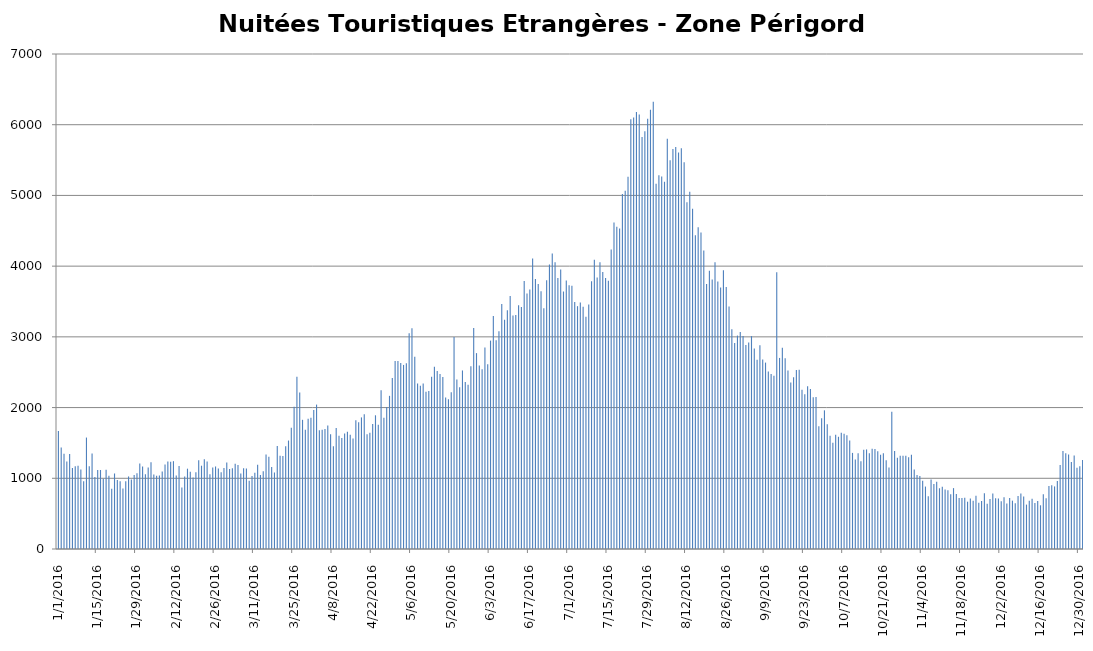
| Category | Nuitées Etrangères |
|---|---|
| 1/1/16 | 1670 |
| 1/2/16 | 1435 |
| 1/3/16 | 1347 |
| 1/4/16 | 1237 |
| 1/5/16 | 1344 |
| 1/6/16 | 1145 |
| 1/7/16 | 1171 |
| 1/8/16 | 1179 |
| 1/9/16 | 1125 |
| 1/10/16 | 958 |
| 1/11/16 | 1576 |
| 1/12/16 | 1171 |
| 1/13/16 | 1351 |
| 1/14/16 | 1017 |
| 1/15/16 | 1117 |
| 1/16/16 | 1117 |
| 1/17/16 | 992 |
| 1/18/16 | 1119 |
| 1/19/16 | 1037 |
| 1/20/16 | 853 |
| 1/21/16 | 1068 |
| 1/22/16 | 977 |
| 1/23/16 | 959 |
| 1/24/16 | 857 |
| 1/25/16 | 959 |
| 1/26/16 | 1026 |
| 1/27/16 | 982 |
| 1/28/16 | 1047 |
| 1/29/16 | 1070 |
| 1/30/16 | 1210 |
| 1/31/16 | 1167 |
| 2/1/16 | 1056 |
| 2/2/16 | 1152 |
| 2/3/16 | 1226 |
| 2/4/16 | 1055 |
| 2/5/16 | 1036 |
| 2/6/16 | 1038 |
| 2/7/16 | 1097 |
| 2/8/16 | 1196 |
| 2/9/16 | 1237 |
| 2/10/16 | 1235 |
| 2/11/16 | 1242 |
| 2/12/16 | 1040 |
| 2/13/16 | 1174 |
| 2/14/16 | 869 |
| 2/15/16 | 1025 |
| 2/16/16 | 1136 |
| 2/17/16 | 1094 |
| 2/18/16 | 1010 |
| 2/19/16 | 1086 |
| 2/20/16 | 1256 |
| 2/21/16 | 1178 |
| 2/22/16 | 1268 |
| 2/23/16 | 1237 |
| 2/24/16 | 1058 |
| 2/25/16 | 1151 |
| 2/26/16 | 1167 |
| 2/27/16 | 1138 |
| 2/28/16 | 1086 |
| 2/29/16 | 1144 |
| 3/1/16 | 1225 |
| 3/2/16 | 1132 |
| 3/3/16 | 1141 |
| 3/4/16 | 1204 |
| 3/5/16 | 1187 |
| 3/6/16 | 1066 |
| 3/7/16 | 1142 |
| 3/8/16 | 1138 |
| 3/9/16 | 966 |
| 3/10/16 | 1032 |
| 3/11/16 | 1077 |
| 3/12/16 | 1192 |
| 3/13/16 | 1046 |
| 3/14/16 | 1100 |
| 3/15/16 | 1335 |
| 3/16/16 | 1306 |
| 3/17/16 | 1158 |
| 3/18/16 | 1082 |
| 3/19/16 | 1455 |
| 3/20/16 | 1318 |
| 3/21/16 | 1315 |
| 3/22/16 | 1453 |
| 3/23/16 | 1534 |
| 3/24/16 | 1715 |
| 3/25/16 | 2011 |
| 3/26/16 | 2436 |
| 3/27/16 | 2214 |
| 3/28/16 | 1827 |
| 3/29/16 | 1687 |
| 3/30/16 | 1843 |
| 3/31/16 | 1856 |
| 4/1/16 | 1966 |
| 4/2/16 | 2042 |
| 4/3/16 | 1678 |
| 4/4/16 | 1688 |
| 4/5/16 | 1696 |
| 4/6/16 | 1747 |
| 4/7/16 | 1623 |
| 4/8/16 | 1453 |
| 4/9/16 | 1712 |
| 4/10/16 | 1603 |
| 4/11/16 | 1569 |
| 4/12/16 | 1634 |
| 4/13/16 | 1659 |
| 4/14/16 | 1617 |
| 4/15/16 | 1563 |
| 4/16/16 | 1822 |
| 4/17/16 | 1794 |
| 4/18/16 | 1861 |
| 4/19/16 | 1906 |
| 4/20/16 | 1624 |
| 4/21/16 | 1644 |
| 4/22/16 | 1769 |
| 4/23/16 | 1891 |
| 4/24/16 | 1758 |
| 4/25/16 | 2246 |
| 4/26/16 | 1856 |
| 4/27/16 | 2007 |
| 4/28/16 | 2166 |
| 4/29/16 | 2419 |
| 4/30/16 | 2657 |
| 5/1/16 | 2660 |
| 5/2/16 | 2631 |
| 5/3/16 | 2603 |
| 5/4/16 | 2626 |
| 5/5/16 | 3051 |
| 5/6/16 | 3121 |
| 5/7/16 | 2718 |
| 5/8/16 | 2341 |
| 5/9/16 | 2308 |
| 5/10/16 | 2340 |
| 5/11/16 | 2222 |
| 5/12/16 | 2236 |
| 5/13/16 | 2436 |
| 5/14/16 | 2577 |
| 5/15/16 | 2518 |
| 5/16/16 | 2475 |
| 5/17/16 | 2432.5 |
| 5/18/16 | 2143 |
| 5/19/16 | 2116 |
| 5/20/16 | 2215 |
| 5/21/16 | 2998 |
| 5/22/16 | 2398 |
| 5/23/16 | 2287 |
| 5/24/16 | 2525 |
| 5/25/16 | 2361 |
| 5/26/16 | 2324 |
| 5/27/16 | 2584 |
| 5/28/16 | 3124 |
| 5/29/16 | 2770 |
| 5/30/16 | 2595 |
| 5/31/16 | 2543 |
| 6/1/16 | 2850 |
| 6/2/16 | 2613 |
| 6/3/16 | 2947 |
| 6/4/16 | 3296 |
| 6/5/16 | 2953 |
| 6/6/16 | 3079 |
| 6/7/16 | 3465 |
| 6/8/16 | 3242 |
| 6/9/16 | 3375 |
| 6/10/16 | 3578 |
| 6/11/16 | 3302 |
| 6/12/16 | 3309 |
| 6/13/16 | 3446 |
| 6/14/16 | 3421 |
| 6/15/16 | 3790 |
| 6/16/16 | 3613 |
| 6/17/16 | 3670 |
| 6/18/16 | 4107 |
| 6/19/16 | 3817 |
| 6/20/16 | 3749 |
| 6/21/16 | 3644 |
| 6/22/16 | 3403 |
| 6/23/16 | 3802 |
| 6/24/16 | 4024 |
| 6/25/16 | 4178 |
| 6/26/16 | 4056 |
| 6/27/16 | 3834 |
| 6/28/16 | 3954 |
| 6/29/16 | 3640 |
| 6/30/16 | 3797 |
| 7/1/16 | 3730 |
| 7/2/16 | 3722 |
| 7/3/16 | 3492 |
| 7/4/16 | 3434 |
| 7/5/16 | 3487 |
| 7/6/16 | 3425 |
| 7/7/16 | 3286 |
| 7/8/16 | 3457 |
| 7/9/16 | 3788 |
| 7/10/16 | 4089 |
| 7/11/16 | 3841 |
| 7/12/16 | 4056 |
| 7/13/16 | 3918 |
| 7/14/16 | 3833 |
| 7/15/16 | 3794 |
| 7/16/16 | 4234 |
| 7/17/16 | 4618 |
| 7/18/16 | 4557 |
| 7/19/16 | 4534 |
| 7/20/16 | 5019 |
| 7/21/16 | 5065 |
| 7/22/16 | 5265 |
| 7/23/16 | 6078 |
| 7/24/16 | 6103 |
| 7/25/16 | 6179 |
| 7/26/16 | 6145 |
| 7/27/16 | 5825 |
| 7/28/16 | 5907 |
| 7/29/16 | 6084 |
| 7/30/16 | 6213 |
| 7/31/16 | 6323 |
| 8/1/16 | 5164 |
| 8/2/16 | 5285 |
| 8/3/16 | 5269 |
| 8/4/16 | 5195 |
| 8/5/16 | 5801 |
| 8/6/16 | 5499 |
| 8/7/16 | 5657 |
| 8/8/16 | 5685 |
| 8/9/16 | 5608 |
| 8/10/16 | 5667 |
| 8/11/16 | 5468 |
| 8/12/16 | 4903 |
| 8/13/16 | 5053 |
| 8/14/16 | 4810 |
| 8/15/16 | 4437 |
| 8/16/16 | 4550 |
| 8/17/16 | 4477 |
| 8/18/16 | 4222 |
| 8/19/16 | 3747 |
| 8/20/16 | 3934 |
| 8/21/16 | 3811 |
| 8/22/16 | 4056 |
| 8/23/16 | 3784 |
| 8/24/16 | 3697 |
| 8/25/16 | 3943 |
| 8/26/16 | 3705 |
| 8/27/16 | 3431 |
| 8/28/16 | 3106 |
| 8/29/16 | 2914 |
| 8/30/16 | 3018 |
| 8/31/16 | 3069 |
| 9/1/16 | 3011 |
| 9/2/16 | 2884 |
| 9/3/16 | 2921 |
| 9/4/16 | 3011 |
| 9/5/16 | 2837 |
| 9/6/16 | 2676 |
| 9/7/16 | 2882 |
| 9/8/16 | 2681 |
| 9/9/16 | 2636 |
| 9/10/16 | 2510 |
| 9/11/16 | 2476 |
| 9/12/16 | 2450 |
| 9/13/16 | 3915 |
| 9/14/16 | 2702 |
| 9/15/16 | 2847 |
| 9/16/16 | 2699 |
| 9/17/16 | 2523 |
| 9/18/16 | 2355 |
| 9/19/16 | 2429 |
| 9/20/16 | 2531 |
| 9/21/16 | 2535 |
| 9/22/16 | 2253 |
| 9/23/16 | 2190 |
| 9/24/16 | 2302 |
| 9/25/16 | 2262 |
| 9/26/16 | 2147 |
| 9/27/16 | 2150 |
| 9/28/16 | 1736 |
| 9/29/16 | 1849 |
| 9/30/16 | 1961 |
| 10/1/16 | 1764 |
| 10/2/16 | 1603 |
| 10/3/16 | 1503 |
| 10/4/16 | 1615 |
| 10/5/16 | 1587 |
| 10/6/16 | 1643 |
| 10/7/16 | 1630 |
| 10/8/16 | 1608 |
| 10/9/16 | 1536 |
| 10/10/16 | 1359 |
| 10/11/16 | 1265 |
| 10/12/16 | 1353 |
| 10/13/16 | 1242 |
| 10/14/16 | 1402 |
| 10/15/16 | 1408 |
| 10/16/16 | 1353 |
| 10/17/16 | 1418 |
| 10/18/16 | 1415 |
| 10/19/16 | 1381 |
| 10/20/16 | 1334 |
| 10/21/16 | 1353 |
| 10/22/16 | 1254 |
| 10/23/16 | 1152 |
| 10/24/16 | 1940 |
| 10/25/16 | 1386 |
| 10/26/16 | 1289 |
| 10/27/16 | 1317 |
| 10/28/16 | 1317 |
| 10/29/16 | 1320 |
| 10/30/16 | 1297 |
| 10/31/16 | 1334 |
| 11/1/16 | 1125 |
| 11/2/16 | 1047 |
| 11/3/16 | 1032 |
| 11/4/16 | 966 |
| 11/5/16 | 883 |
| 11/6/16 | 746 |
| 11/7/16 | 982 |
| 11/8/16 | 918 |
| 11/9/16 | 950 |
| 11/10/16 | 859 |
| 11/11/16 | 879 |
| 11/12/16 | 843 |
| 11/13/16 | 832 |
| 11/14/16 | 773 |
| 11/15/16 | 861 |
| 11/16/16 | 777 |
| 11/17/16 | 722 |
| 11/18/16 | 720 |
| 11/19/16 | 726 |
| 11/20/16 | 669 |
| 11/21/16 | 715 |
| 11/22/16 | 684 |
| 11/23/16 | 753 |
| 11/24/16 | 654 |
| 11/25/16 | 678 |
| 11/26/16 | 790 |
| 11/27/16 | 640 |
| 11/28/16 | 707 |
| 11/29/16 | 785 |
| 11/30/16 | 718 |
| 12/1/16 | 715 |
| 12/2/16 | 675 |
| 12/3/16 | 731 |
| 12/4/16 | 643 |
| 12/5/16 | 721 |
| 12/6/16 | 684 |
| 12/7/16 | 647 |
| 12/8/16 | 751 |
| 12/9/16 | 784 |
| 12/10/16 | 742 |
| 12/11/16 | 628 |
| 12/12/16 | 683 |
| 12/13/16 | 711 |
| 12/14/16 | 651 |
| 12/15/16 | 678 |
| 12/16/16 | 618 |
| 12/17/16 | 774 |
| 12/18/16 | 718 |
| 12/19/16 | 891 |
| 12/20/16 | 901 |
| 12/21/16 | 885 |
| 12/22/16 | 962 |
| 12/23/16 | 1189 |
| 12/24/16 | 1387 |
| 12/25/16 | 1354 |
| 12/26/16 | 1335 |
| 12/27/16 | 1229 |
| 12/28/16 | 1322 |
| 12/29/16 | 1148 |
| 12/30/16 | 1171 |
| 12/31/16 | 1257 |